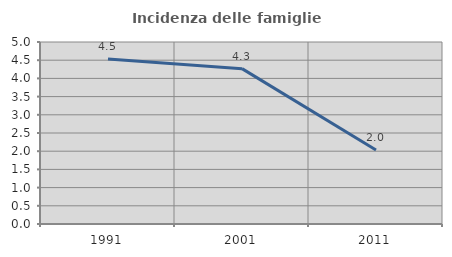
| Category | Incidenza delle famiglie numerose |
|---|---|
| 1991.0 | 4.534 |
| 2001.0 | 4.268 |
| 2011.0 | 2.031 |